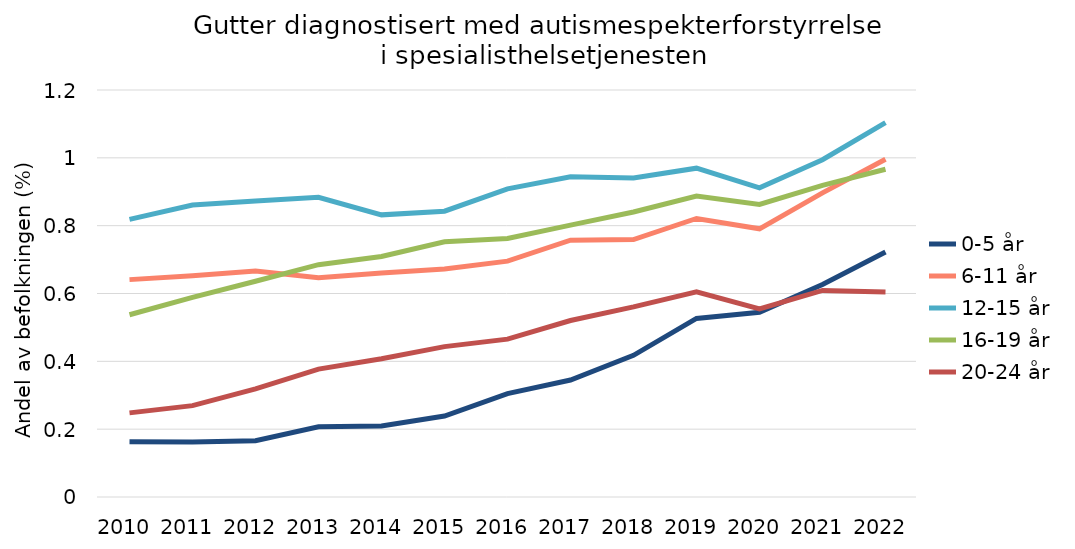
| Category | 0-5 år | 6-11 år | 12-15 år | 16-19 år | 20-24 år |
|---|---|---|---|---|---|
| 2010.0 | 0.163 | 0.641 | 0.818 | 0.537 | 0.248 |
| 2011.0 | 0.162 | 0.652 | 0.861 | 0.588 | 0.269 |
| 2012.0 | 0.166 | 0.666 | 0.873 | 0.636 | 0.319 |
| 2013.0 | 0.207 | 0.647 | 0.883 | 0.685 | 0.377 |
| 2014.0 | 0.209 | 0.66 | 0.832 | 0.709 | 0.408 |
| 2015.0 | 0.239 | 0.672 | 0.843 | 0.752 | 0.443 |
| 2016.0 | 0.305 | 0.695 | 0.908 | 0.762 | 0.465 |
| 2017.0 | 0.345 | 0.757 | 0.944 | 0.802 | 0.52 |
| 2018.0 | 0.418 | 0.759 | 0.94 | 0.84 | 0.561 |
| 2019.0 | 0.527 | 0.821 | 0.97 | 0.887 | 0.605 |
| 2020.0 | 0.545 | 0.791 | 0.912 | 0.863 | 0.555 |
| 2021.0 | 0.626 | 0.897 | 0.994 | 0.919 | 0.609 |
| 2022.0 | 0.722 | 0.996 | 1.104 | 0.966 | 0.604 |